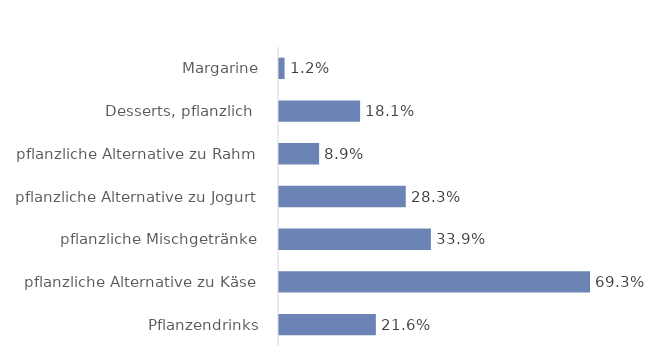
| Category | Δ 2017 bis 2021 |
|---|---|
| Pflanzendrinks | 0.216 |
| pflanzliche Alternative zu Käse | 0.693 |
| pflanzliche Mischgetränke | 0.339 |
| pflanzliche Alternative zu Jogurt | 0.283 |
| pflanzliche Alternative zu Rahm | 0.089 |
| Desserts, pflanzlich  | 0.181 |
| Margarine | 0.012 |